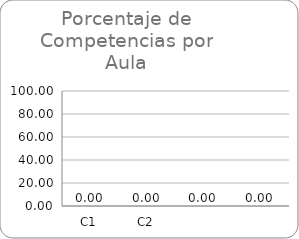
| Category | Series 0 |
|---|---|
| C1 | 0 |
| C2 | 0 |